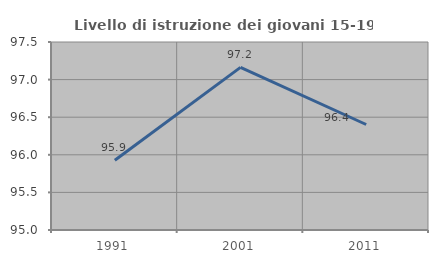
| Category | Livello di istruzione dei giovani 15-19 anni |
|---|---|
| 1991.0 | 95.928 |
| 2001.0 | 97.163 |
| 2011.0 | 96.403 |